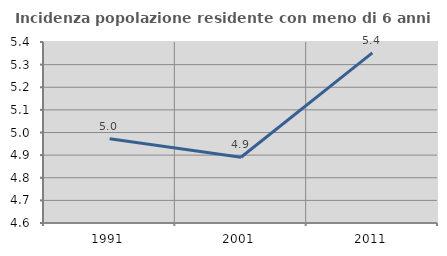
| Category | Incidenza popolazione residente con meno di 6 anni |
|---|---|
| 1991.0 | 4.972 |
| 2001.0 | 4.891 |
| 2011.0 | 5.352 |